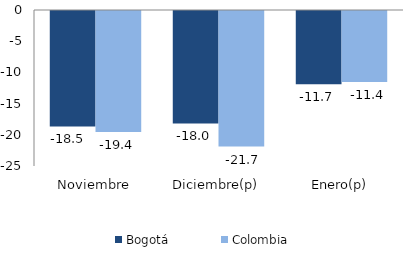
| Category | Bogotá | Colombia |
|---|---|---|
| Noviembre | -18.508 | -19.384 |
| Diciembre(p) | -18.011 | -21.729 |
| Enero(p) | -11.723 | -11.384 |